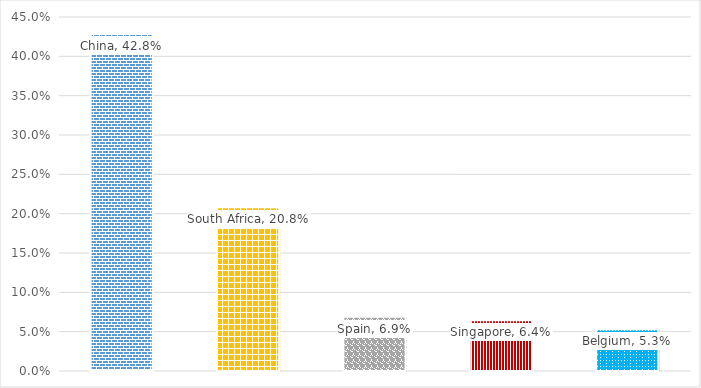
| Category | %Share |
|---|---|
| China | 0.428 |
| South Africa | 0.208 |
| Spain | 0.069 |
| Singapore | 0.064 |
| Belgium | 0.053 |